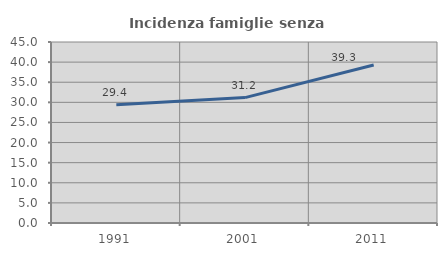
| Category | Incidenza famiglie senza nuclei |
|---|---|
| 1991.0 | 29.42 |
| 2001.0 | 31.178 |
| 2011.0 | 39.294 |